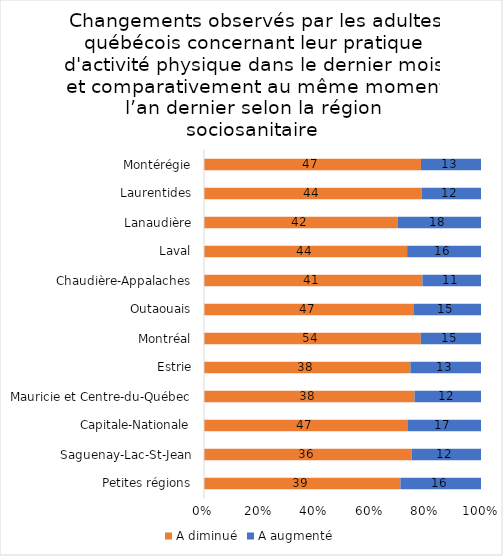
| Category | A diminué | A augmenté |
|---|---|---|
| Petites régions | 39 | 16 |
| Saguenay-Lac-St-Jean | 36 | 12 |
| Capitale-Nationale | 47 | 17 |
| Mauricie et Centre-du-Québec | 38 | 12 |
| Estrie | 38 | 13 |
| Montréal | 54 | 15 |
| Outaouais | 47 | 15 |
| Chaudière-Appalaches | 41 | 11 |
| Laval | 44 | 16 |
| Lanaudière | 42 | 18 |
| Laurentides | 44 | 12 |
| Montérégie | 47 | 13 |